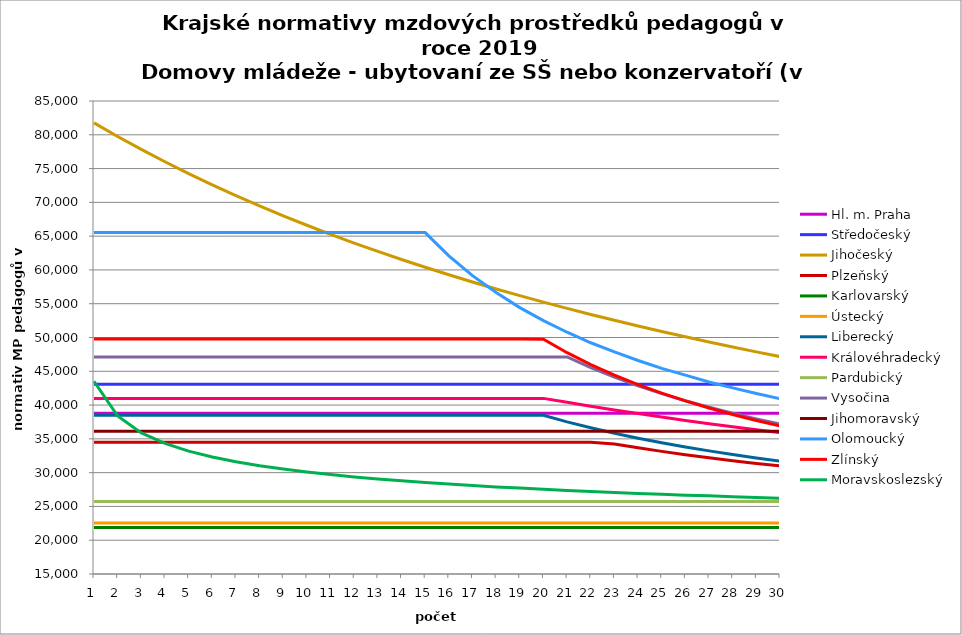
| Category | Hl. m. Praha | Středočeský | Jihočeský | Plzeňský | Karlovarský  | Ústecký   | Liberecký | Královéhradecký | Pardubický | Vysočina | Jihomoravský | Olomoucký | Zlínský | Moravskoslezský |
|---|---|---|---|---|---|---|---|---|---|---|---|---|---|---|
| 0 | 38780.884 | 43086 | 81768.107 | 34500 | 21866.667 | 22548.82 | 38475.29 | 40988.82 | 25740.36 | 47127.995 | 36125.421 | 65524.307 | 49790.576 | 43519.149 |
| 1 | 38780.884 | 43086 | 79751.606 | 34500 | 21866.667 | 22548.82 | 38475.29 | 40988.82 | 25740.36 | 47127.995 | 36125.421 | 65524.307 | 49790.576 | 38375.235 |
| 2 | 38780.884 | 43086 | 77832.169 | 34500 | 21866.667 | 22548.82 | 38475.29 | 40988.82 | 25740.36 | 47127.995 | 36125.421 | 65524.307 | 49790.576 | 35884.211 |
| 3 | 38780.884 | 43086 | 76002.954 | 34500 | 21866.667 | 22548.82 | 38475.29 | 40988.82 | 25740.36 | 47127.995 | 36125.421 | 65524.307 | 49790.576 | 34318.792 |
| 4 | 38780.884 | 43086 | 74257.745 | 34500 | 21866.667 | 22548.82 | 38475.29 | 40988.82 | 25740.36 | 47127.995 | 36125.421 | 65524.307 | 49790.576 | 33177.616 |
| 5 | 38780.884 | 43086 | 72590.886 | 34500 | 21866.667 | 22548.82 | 38475.29 | 40988.82 | 25740.36 | 47127.995 | 36125.421 | 65524.307 | 49790.576 | 32312.796 |
| 6 | 38780.884 | 43086 | 70997.215 | 34500 | 21866.667 | 22548.82 | 38475.29 | 40988.82 | 25740.36 | 47127.995 | 36125.421 | 65524.307 | 49790.576 | 31613.601 |
| 7 | 38780.884 | 43086 | 69472.016 | 34500 | 21866.667 | 22548.82 | 38475.29 | 40988.82 | 25740.36 | 47127.995 | 36125.421 | 65524.307 | 49790.576 | 31014.405 |
| 8 | 38780.884 | 43086 | 68010.97 | 34500 | 21866.667 | 22548.82 | 38475.29 | 40988.82 | 25740.36 | 47127.995 | 36125.421 | 65524.307 | 49790.576 | 30528.358 |
| 9 | 38780.884 | 43086 | 66610.111 | 34500 | 21866.667 | 22548.82 | 38475.29 | 40988.82 | 25740.36 | 47127.995 | 36125.421 | 65524.307 | 49790.576 | 30101.545 |
| 10 | 38780.884 | 43086 | 65265.796 | 34500 | 21866.667 | 22548.82 | 38475.29 | 40988.82 | 25740.36 | 47127.995 | 36125.421 | 65524.307 | 49790.576 | 29708.061 |
| 11 | 38780.884 | 43086 | 63974.67 | 34500 | 21866.667 | 22548.82 | 38475.29 | 40988.82 | 25740.36 | 47127.995 | 36125.421 | 65524.307 | 49790.576 | 29366.834 |
| 12 | 38780.884 | 43086 | 62733.636 | 34500 | 21866.667 | 22548.82 | 38475.29 | 40988.82 | 25740.36 | 47127.995 | 36125.421 | 65524.307 | 49790.576 | 29074.627 |
| 13 | 38780.884 | 43086 | 61539.835 | 34500 | 21866.667 | 22548.82 | 38475.29 | 40988.82 | 25740.36 | 47127.995 | 36125.421 | 65524.307 | 49790.576 | 28788.177 |
| 14 | 38780.884 | 43086 | 60390.62 | 34500 | 21866.667 | 22548.82 | 38475.29 | 40988.82 | 25740.36 | 47127.995 | 36125.421 | 65524.307 | 49790.576 | 28547.104 |
| 15 | 38780.884 | 43086 | 59283.541 | 34500 | 21866.667 | 22548.82 | 38475.29 | 40988.82 | 25740.36 | 47127.995 | 36125.421 | 62080.989 | 49790.576 | 28310.035 |
| 16 | 38780.884 | 43086 | 58216.321 | 34500 | 21866.667 | 22548.82 | 38475.29 | 40988.82 | 25740.36 | 47127.995 | 36125.421 | 59155.228 | 49790.576 | 28096.154 |
| 17 | 38780.884 | 43086 | 57186.845 | 34500 | 21866.667 | 22548.82 | 38475.29 | 40988.82 | 25740.36 | 47127.995 | 36125.421 | 56652.186 | 49790.576 | 27885.481 |
| 18 | 38780.884 | 43086 | 56193.146 | 34500 | 21866.667 | 22548.82 | 38475.29 | 40988.82 | 25740.36 | 47127.995 | 36125.421 | 54426.016 | 49790.576 | 27715.447 |
| 19 | 38780.884 | 43086 | 55233.392 | 34500 | 21866.667 | 22548.82 | 38475.29 | 40988.82 | 25740.36 | 47127.995 | 36125.421 | 52505.098 | 49751.424 | 27528.937 |
| 20 | 38780.884 | 43086 | 54305.871 | 34500 | 21866.667 | 22548.82 | 37510.962 | 40403.265 | 25740.36 | 47127.995 | 36125.421 | 50779.267 | 47753.081 | 27363.211 |
| 21 | 38780.884 | 43086 | 53408.987 | 34500 | 21866.667 | 22548.82 | 36635.47 | 39834.205 | 25740.36 | 45543.38 | 36125.421 | 49223.529 | 45991.707 | 27217.565 |
| 22 | 38780.884 | 43086 | 52541.246 | 34243.176 | 21866.667 | 22548.82 | 35836.251 | 39280.952 | 25740.36 | 44123.037 | 36125.421 | 47874.136 | 44425.909 | 27073.461 |
| 23 | 38780.884 | 43086 | 51701.252 | 33685.924 | 21866.667 | 22548.82 | 35103.059 | 38742.857 | 25740.36 | 42846.297 | 36125.421 | 46596.752 | 43023.512 | 26930.876 |
| 24 | 38780.884 | 43086 | 50887.693 | 33146.517 | 21866.667 | 22548.82 | 34427.448 | 38219.305 | 25740.36 | 41691.795 | 36125.421 | 45437.104 | 41759.119 | 26807.339 |
| 25 | 38780.884 | 43086 | 50099.341 | 32649.842 | 21866.667 | 22548.82 | 33802.39 | 37709.714 | 25740.36 | 40633.815 | 36125.421 | 44431.858 | 40612.401 | 26667.536 |
| 26 | 38780.884 | 43086 | 49335.043 | 32192.846 | 21866.667 | 22548.82 | 33221.985 | 37248.542 | 25740.36 | 39670.06 | 36125.421 | 43423.135 | 39566.894 | 26563.636 |
| 27 | 38780.884 | 43086 | 48593.714 | 31772.832 | 21866.667 | 22548.82 | 32681.241 | 36798.513 | 25740.36 | 38780.062 | 36125.421 | 42549.153 | 38609.109 | 26443.439 |
| 28 | 38780.884 | 43086 | 47874.335 | 31363.636 | 21866.667 | 22548.82 | 32175.904 | 36359.229 | 25740.36 | 37960.489 | 36125.421 | 41709.657 | 37727.892 | 26324.324 |
| 29 | 38780.884 | 43086 | 47175.944 | 30988.024 | 21866.667 | 22548.82 | 31702.323 | 35930.309 | 25740.36 | 37201.621 | 36125.421 | 40944.343 | 36913.932 | 26223.077 |